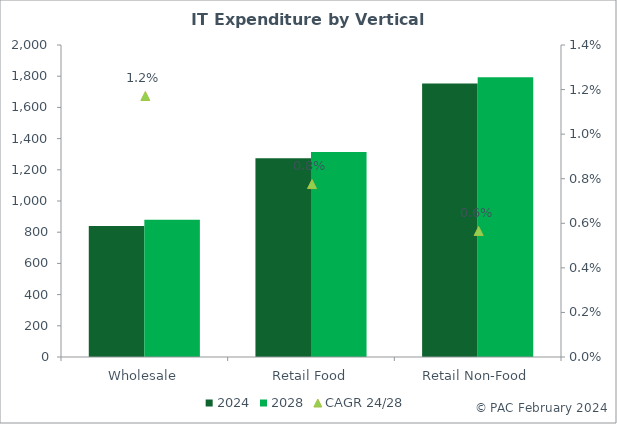
| Category | 2024 | 2028 |
|---|---|---|
| Wholesale | 839.058 | 879.058 |
| Retail Food | 1273.736 | 1313.736 |
| Retail Non-Food | 1753.736 | 1793.736 |